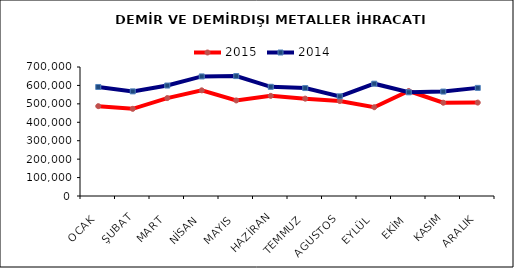
| Category | 2015 | 2014 |
|---|---|---|
| OCAK | 487506.196 | 591640.936 |
| ŞUBAT | 472961.285 | 567770.653 |
| MART | 531387.849 | 599391.982 |
| NİSAN | 573363.506 | 648813.58 |
| MAYIS | 518548.779 | 650682.998 |
| HAZİRAN | 543306.303 | 592547.328 |
| TEMMUZ | 528202.876 | 585628.408 |
| AGUSTOS | 515375.603 | 540780.783 |
| EYLÜL | 481702.416 | 609429.699 |
| EKİM | 569771.244 | 562722.651 |
| KASIM | 506143.418 | 566707.441 |
| ARALIK | 506845.311 | 586715.683 |